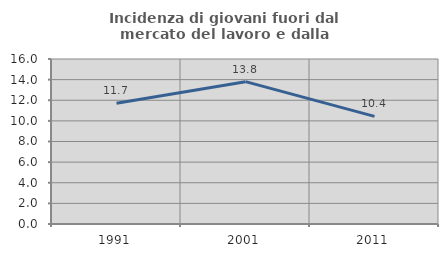
| Category | Incidenza di giovani fuori dal mercato del lavoro e dalla formazione  |
|---|---|
| 1991.0 | 11.719 |
| 2001.0 | 13.802 |
| 2011.0 | 10.437 |